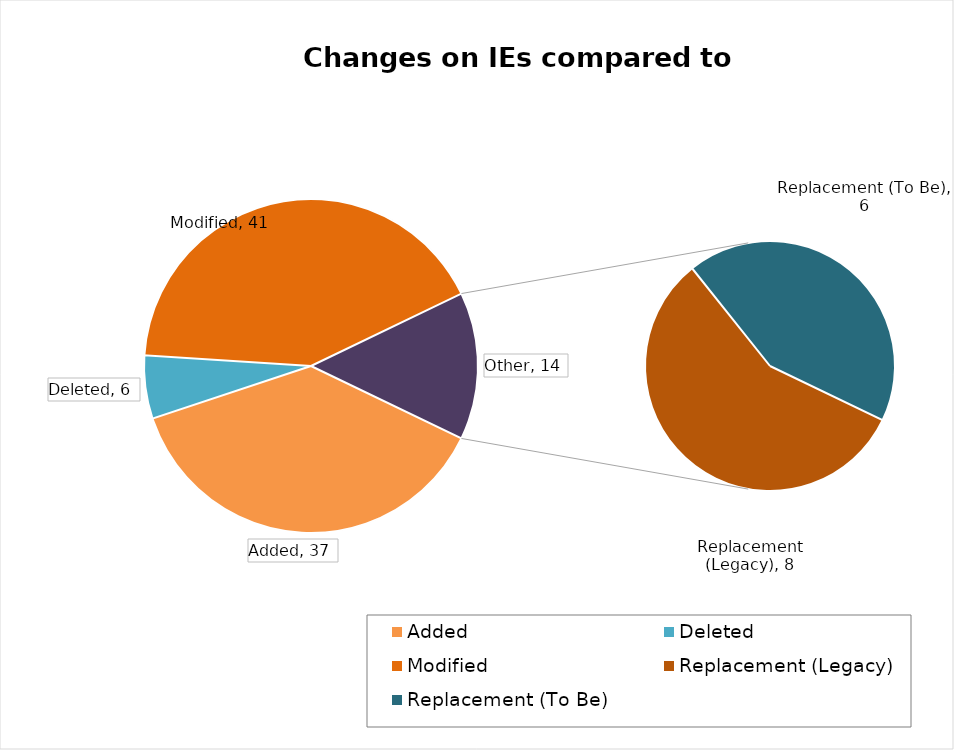
| Category | Total |
|---|---|
| Added | 37 |
| Deleted | 6 |
| Modified | 41 |
| Replacement (Legacy) | 8 |
| Replacement (To Be) | 6 |